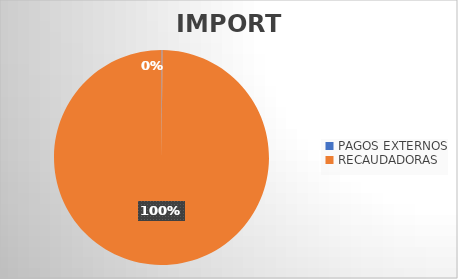
| Category | IMPORTE |
|---|---|
| PAGOS EXTERNOS | 213983.17 |
| RECAUDADORAS | 143948001.41 |